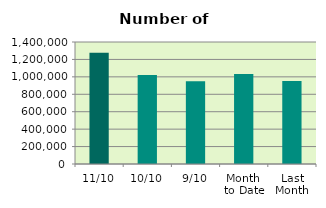
| Category | Series 0 |
|---|---|
| 11/10 | 1277492 |
| 10/10 | 1022704 |
| 9/10 | 950950 |
| Month 
to Date | 1031939.556 |
| Last
Month | 952931.048 |